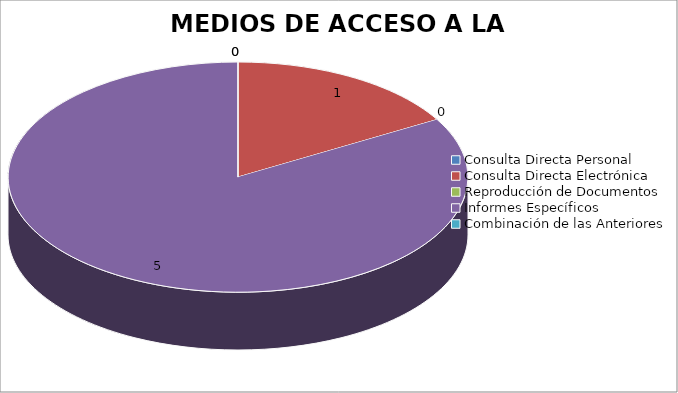
| Category | MEDIOS DE ACCESO A LA INFORMACIÓN |
|---|---|
| 0 | 0 |
| 1 | 1 |
| 2 | 0 |
| 3 | 5 |
| 4 | 0 |